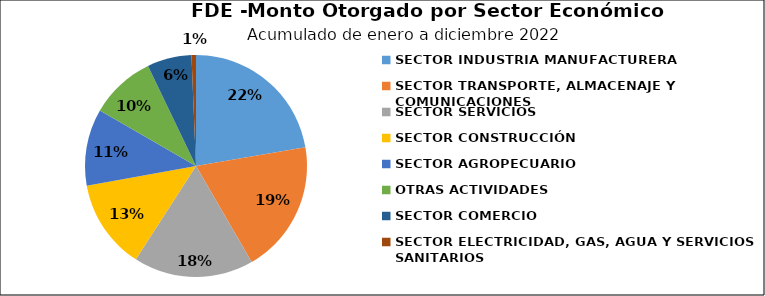
| Category | Monto | Créditos |
|---|---|---|
| SECTOR INDUSTRIA MANUFACTURERA | 3.434 | 58 |
| SECTOR TRANSPORTE, ALMACENAJE Y COMUNICACIONES | 2.976 | 8 |
| SECTOR SERVICIOS | 2.689 | 80 |
| SECTOR CONSTRUCCIÓN | 2.009 | 3 |
| SECTOR AGROPECUARIO | 1.721 | 15 |
| OTRAS ACTIVIDADES | 1.469 | 5 |
| SECTOR COMERCIO | 0.995 | 71 |
| SECTOR ELECTRICIDAD, GAS, AGUA Y SERVICIOS SANITARIOS | 0.1 | 2 |